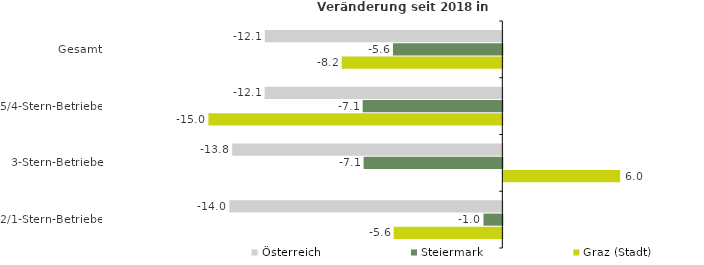
| Category | Österreich | Steiermark | Graz (Stadt) |
|---|---|---|---|
| Gesamt | -12.137 | -5.59 | -8.211 |
| 5/4-Stern-Betriebe | -12.15 | -7.138 | -15.022 |
| 3-Stern-Betriebe | -13.805 | -7.09 | 5.971 |
| 2/1-Stern-Betriebe | -13.951 | -0.963 | -5.551 |